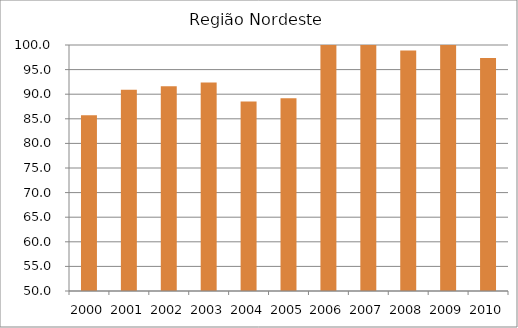
| Category | Região Nordeste |
|---|---|
| 2000.0 | 85.7 |
| 2001.0 | 90.9 |
| 2002.0 | 91.6 |
| 2003.0 | 92.4 |
| 2004.0 | 88.5 |
| 2005.0 | 89.2 |
| 2006.0 | 100.1 |
| 2007.0 | 102.2 |
| 2008.0 | 98.9 |
| 2009.0 | 100.2 |
| 2010.0 | 97.34 |